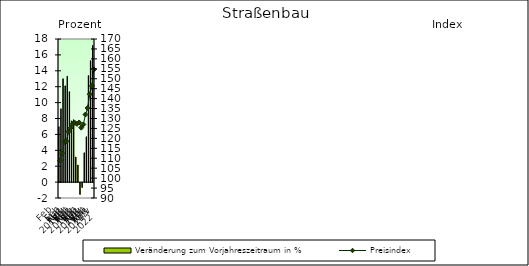
| Category | Veränderung zum Vorjahreszeitraum in % |
|---|---|
| 0 | 6.974 |
| 1 | 9.223 |
| 2 | 13.002 |
| 3 | 12.11 |
| 4 | 13.315 |
| 5 | 11.378 |
| 6 | 7.699 |
| 7 | 7.848 |
| 8 | 3.16 |
| 9 | 2.155 |
| 10 | -1.493 |
| 11 | -0.626 |
| 12 | 3.692 |
| 13 | 5.703 |
| 14 | 13.397 |
| 15 | 15.276 |
| 16 | 17.197 |